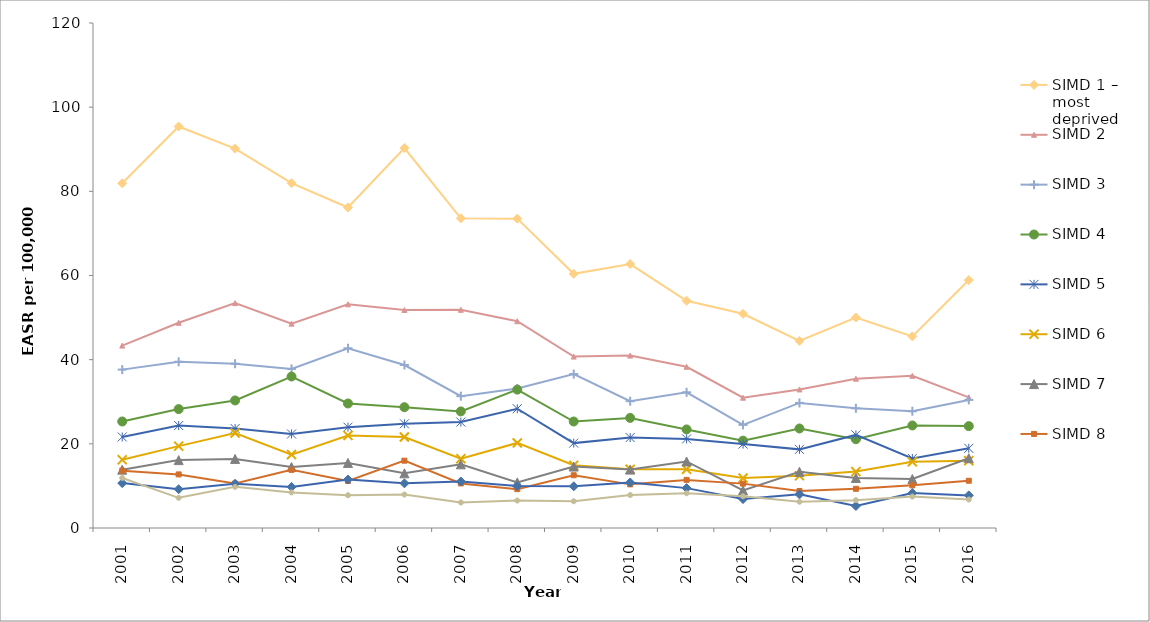
| Category | SIMD 1 – most deprived | SIMD 2 | SIMD 3 | SIMD 4 | SIMD 5 | SIMD 6 | SIMD 7 | SIMD 8 | SIMD 9 | SIMD 10 – least deprived |
|---|---|---|---|---|---|---|---|---|---|---|
| 2001 | 81.91 | 43.342 | 37.633 | 25.313 | 21.639 | 16.22 | 13.865 | 13.622 | 10.667 | 11.892 |
| 2002 | 95.4 | 48.764 | 39.495 | 28.256 | 24.349 | 19.457 | 16.132 | 12.732 | 9.21 | 7.168 |
| 2003 | 90.143 | 53.44 | 39.038 | 30.307 | 23.631 | 22.564 | 16.411 | 10.562 | 10.522 | 9.771 |
| 2004 | 81.929 | 48.564 | 37.806 | 35.996 | 22.343 | 17.443 | 14.49 | 13.813 | 9.762 | 8.46 |
| 2005 | 76.16 | 53.152 | 42.709 | 29.592 | 23.96 | 21.997 | 15.464 | 11.165 | 11.518 | 7.794 |
| 2006 | 90.284 | 51.804 | 38.732 | 28.71 | 24.762 | 21.625 | 12.987 | 16 | 10.608 | 7.957 |
| 2007 | 73.597 | 51.843 | 31.326 | 27.706 | 25.174 | 16.473 | 15.13 | 10.596 | 11.046 | 6.064 |
| 2008 | 73.508 | 49.143 | 33.158 | 32.884 | 28.344 | 20.218 | 10.841 | 9.23 | 9.959 | 6.522 |
| 2009 | 60.402 | 40.737 | 36.569 | 25.306 | 20.175 | 14.9 | 14.6 | 12.536 | 9.905 | 6.362 |
| 2010 | 62.72 | 40.974 | 30.13 | 26.161 | 21.491 | 13.952 | 13.881 | 10.368 | 10.825 | 7.827 |
| 2011 | 53.995 | 38.31 | 32.241 | 23.424 | 21.175 | 13.947 | 15.807 | 11.433 | 9.477 | 8.259 |
| 2012 | 50.902 | 30.963 | 24.509 | 20.758 | 19.944 | 11.866 | 8.935 | 10.545 | 6.875 | 7.545 |
| 2013 | 44.475 | 32.923 | 29.718 | 23.649 | 18.685 | 12.419 | 13.348 | 8.8 | 7.991 | 6.246 |
| 2014 | 50.016 | 35.479 | 28.443 | 21.092 | 22.119 | 13.406 | 11.891 | 9.312 | 5.236 | 6.618 |
| 2015 | 45.534 | 36.155 | 27.749 | 24.365 | 16.535 | 15.729 | 11.64 | 10.133 | 8.317 | 7.47 |
| 2016 | 58.914 | 31.051 | 30.436 | 24.208 | 18.937 | 16.001 | 16.583 | 11.23 | 7.75 | 6.77 |